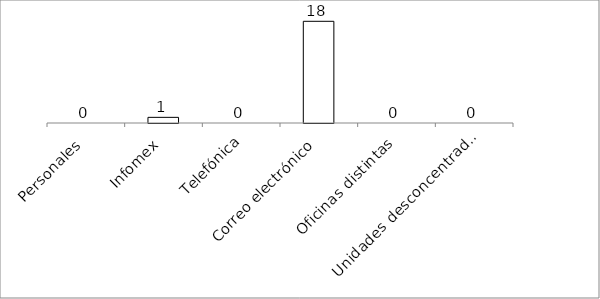
| Category | Series 0 |
|---|---|
| Personales | 0 |
| Infomex | 1 |
| Telefónica | 0 |
| Correo electrónico | 18 |
| Oficinas distintas | 0 |
| Unidades desconcentradas | 0 |